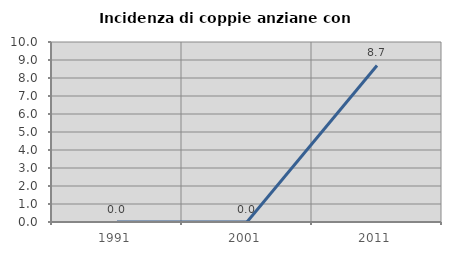
| Category | Incidenza di coppie anziane con figli |
|---|---|
| 1991.0 | 0 |
| 2001.0 | 0 |
| 2011.0 | 8.696 |